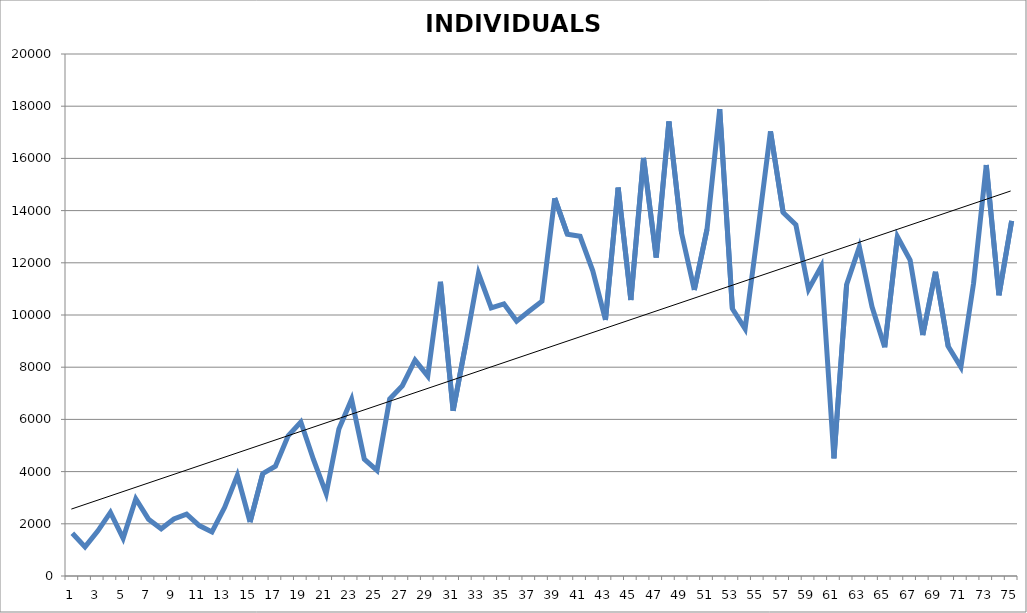
| Category | INDIVIDUALS 1948-2022 |
|---|---|
| 0 | 1640 |
| 1 | 1114 |
| 2 | 1722 |
| 3 | 2436 |
| 4 | 1442 |
| 5 | 2958 |
| 6 | 2177 |
| 7 | 1808 |
| 8 | 2187 |
| 9 | 2372 |
| 10 | 1932 |
| 11 | 1689 |
| 12 | 2631 |
| 13 | 3855 |
| 14 | 2068 |
| 15 | 3925 |
| 16 | 4206 |
| 17 | 5371 |
| 18 | 5899 |
| 19 | 4455 |
| 20 | 3155 |
| 21 | 5635 |
| 22 | 6772 |
| 23 | 4480 |
| 24 | 4048 |
| 25 | 6783 |
| 26 | 7290 |
| 27 | 8272 |
| 28 | 7658 |
| 29 | 11272 |
| 30 | 6333 |
| 31 | 8906 |
| 32 | 11589 |
| 33 | 10271 |
| 34 | 10426 |
| 35 | 9766 |
| 36 | 10154 |
| 37 | 10531 |
| 38 | 14475 |
| 39 | 13096 |
| 40 | 13015 |
| 41 | 11693 |
| 42 | 9812 |
| 43 | 14880 |
| 44 | 10578 |
| 45 | 16019 |
| 46 | 12201 |
| 47 | 17416 |
| 48 | 13125 |
| 49 | 10962 |
| 50 | 13284 |
| 51 | 17889 |
| 52 | 10239 |
| 53 | 9471 |
| 54 | 13190 |
| 55 | 17033 |
| 56 | 13922 |
| 57 | 13458 |
| 58 | 10981 |
| 59 | 11863 |
| 60 | 4509 |
| 61 | 11173 |
| 62 | 12609 |
| 63 | 10313 |
| 64 | 8765 |
| 65 | 12999 |
| 66 | 12102 |
| 67 | 9229 |
| 68 | 11654 |
| 69 | 8802 |
| 70 | 8002 |
| 71 | 11215 |
| 72 | 15744 |
| 73 | 10757 |
| 74 | 13609 |